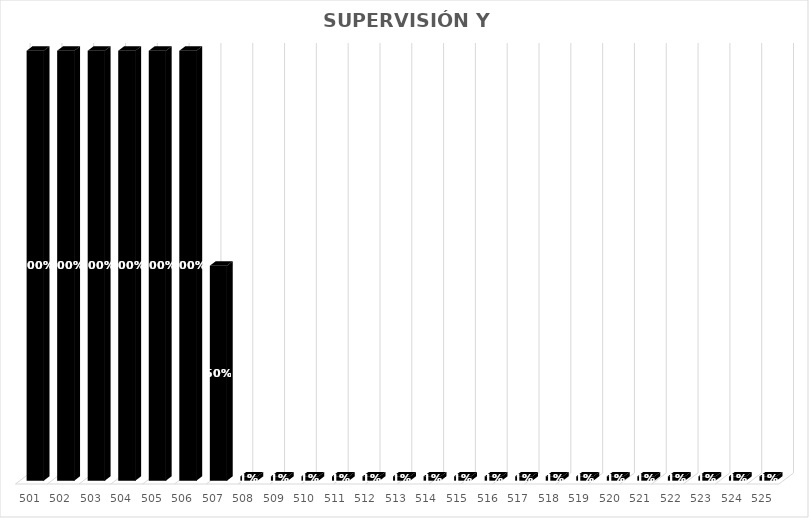
| Category | % Avance |
|---|---|
| 501.0 | 1 |
| 502.0 | 1 |
| 503.0 | 1 |
| 504.0 | 1 |
| 505.0 | 1 |
| 506.0 | 1 |
| 507.0 | 0.5 |
| 508.0 | 0.01 |
| 509.0 | 0.01 |
| 510.0 | 0.01 |
| 511.0 | 0.01 |
| 512.0 | 0.01 |
| 513.0 | 0.01 |
| 514.0 | 0.01 |
| 515.0 | 0.01 |
| 516.0 | 0.01 |
| 517.0 | 0.01 |
| 518.0 | 0.01 |
| 519.0 | 0.01 |
| 520.0 | 0.01 |
| 521.0 | 0.01 |
| 522.0 | 0.01 |
| 523.0 | 0.01 |
| 524.0 | 0.01 |
| 525.0 | 0.01 |